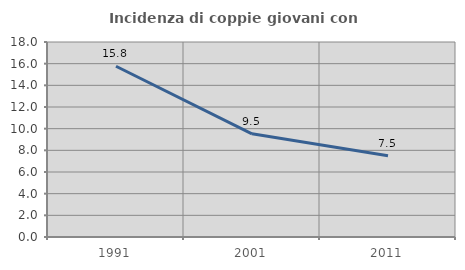
| Category | Incidenza di coppie giovani con figli |
|---|---|
| 1991.0 | 15.762 |
| 2001.0 | 9.524 |
| 2011.0 | 7.505 |